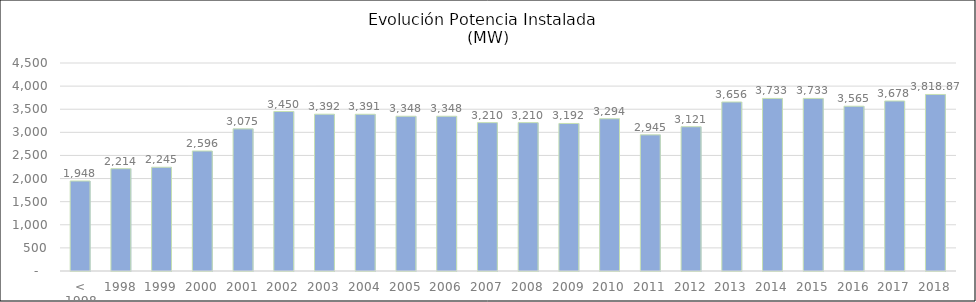
| Category | MW |
|---|---|
| < 1998 | 1947.762 |
| 1998 | 2213.812 |
| 1999 | 2244.612 |
| 2000 | 2596.172 |
| 2001 | 3075.106 |
| 2002 | 3450.406 |
| 2003 | 3392.306 |
| 2004 | 3390.806 |
| 2005 | 3348.006 |
| 2006 | 3348.006 |
| 2007 | 3210.006 |
| 2008 | 3210.006 |
| 2009 | 3191.706 |
| 2010 | 3294.356 |
| 2011 | 2945.356 |
| 2012 | 3121.324 |
| 2013 | 3656.324 |
| 2014 | 3733 |
| 2015 | 3733 |
| 2016 | 3564.7 |
| 2017 | 3678.2 |
| 2018 | 3818.87 |